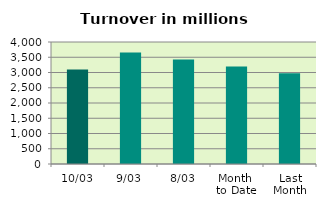
| Category | Series 0 |
|---|---|
| 10/03 | 3099.979 |
| 9/03 | 3652.902 |
| 8/03 | 3424.738 |
| Month 
to Date | 3198.887 |
| Last
Month | 2972.107 |